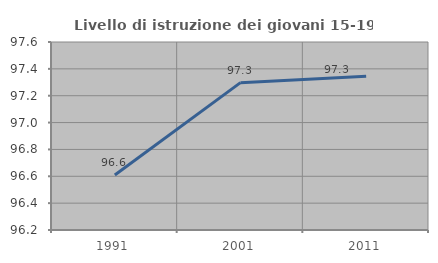
| Category | Livello di istruzione dei giovani 15-19 anni |
|---|---|
| 1991.0 | 96.61 |
| 2001.0 | 97.297 |
| 2011.0 | 97.345 |